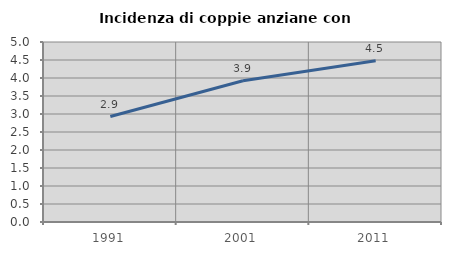
| Category | Incidenza di coppie anziane con figli |
|---|---|
| 1991.0 | 2.929 |
| 2001.0 | 3.923 |
| 2011.0 | 4.479 |